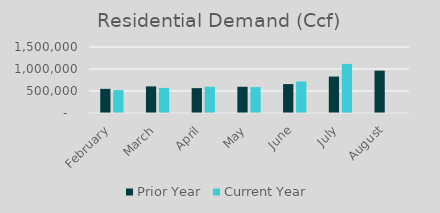
| Category | Prior Year | Current Year |
|---|---|---|
| February | 548904 | 520118 |
| March | 604606 | 569686 |
| April | 564867 | 597404.2 |
| May | 596051 | 588003 |
| June | 657143 | 716727.85 |
| July | 828101 | 1115755.73 |
| August | 963307 | 0 |